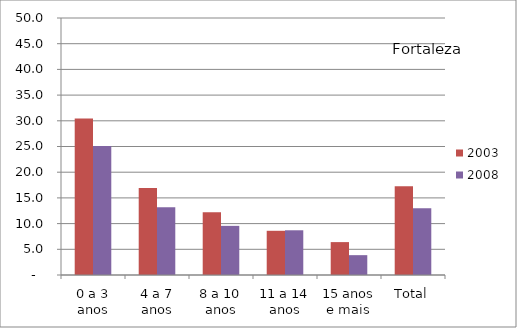
| Category | 2003 | 2008 |
|---|---|---|
| 0 a 3 anos | 30.44 | 25.1 |
| 4 a 7 anos | 16.93 | 13.16 |
| 8 a 10 anos | 12.21 | 9.56 |
| 11 a 14 anos | 8.6 | 8.7 |
| 15 anos e mais | 6.4 | 3.86 |
| Total | 17.25 | 12.97 |